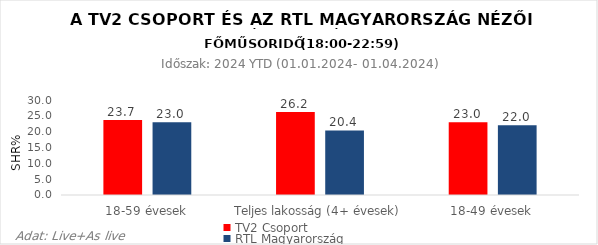
| Category | TV2 Csoport | RTL Magyarország |
|---|---|---|
| 18-59 évesek | 23.7 | 23 |
| Teljes lakosság (4+ évesek) | 26.2 | 20.4 |
| 18-49 évesek | 23 | 22 |